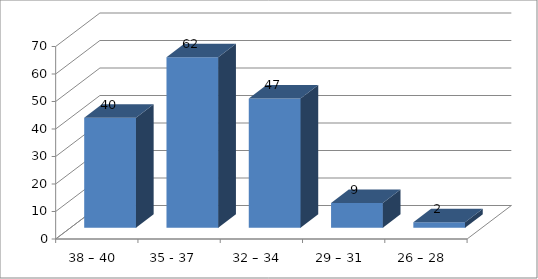
| Category | Series 0 |
|---|---|
| 38 – 40  | 40 |
| 35 - 37   | 62 |
| 32 – 34  | 47 |
| 29 – 31  | 9 |
| 26 – 28  | 2 |